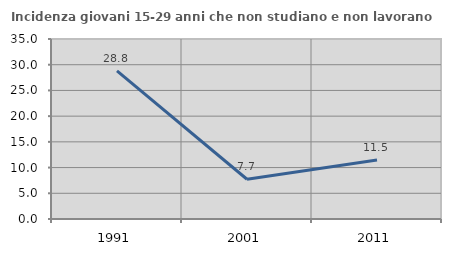
| Category | Incidenza giovani 15-29 anni che non studiano e non lavorano  |
|---|---|
| 1991.0 | 28.814 |
| 2001.0 | 7.731 |
| 2011.0 | 11.468 |